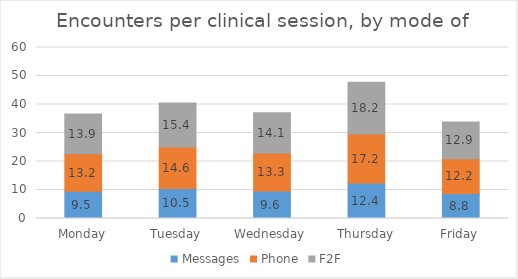
| Category | Messages | Phone | F2F |
|---|---|---|---|
| Monday | 9.523 | 13.186 | 13.918 |
| Tuesday | 10.527 | 14.576 | 15.386 |
| Wednesday | 9.641 | 13.349 | 14.091 |
| Thursday | 12.439 | 17.224 | 18.18 |
| Friday | 8.804 | 12.19 | 12.867 |